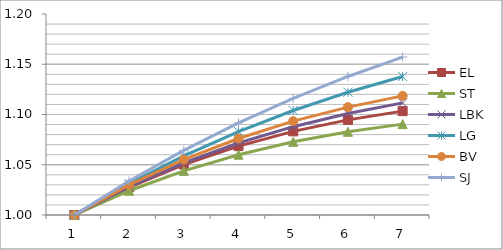
| Category | EL | ST | LBK | LG | BV | SJ |
|---|---|---|---|---|---|---|
| 0 | 1 | 1 | 1 | 1 | 1 | 1 |
| 1 | 1.028 | 1.024 | 1.028 | 1.031 | 1.03 | 1.034 |
| 2 | 1.05 | 1.044 | 1.052 | 1.059 | 1.055 | 1.064 |
| 3 | 1.069 | 1.06 | 1.072 | 1.083 | 1.076 | 1.092 |
| 4 | 1.083 | 1.073 | 1.088 | 1.104 | 1.093 | 1.116 |
| 5 | 1.095 | 1.083 | 1.101 | 1.122 | 1.107 | 1.138 |
| 6 | 1.103 | 1.09 | 1.112 | 1.138 | 1.119 | 1.157 |